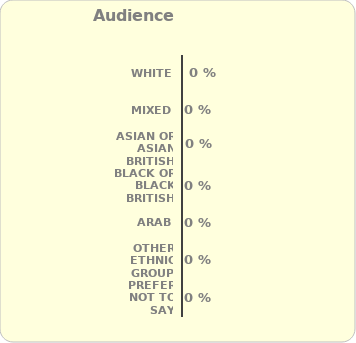
| Category | Series 0 |
|---|---|
| White | 0 |
| Mixed | 0 |
| Asian or Asian British | 0 |
| Black or Black British | 0 |
| Arab | 0 |
| Other ethnic group | 0 |
| Prefer not to say | 0 |